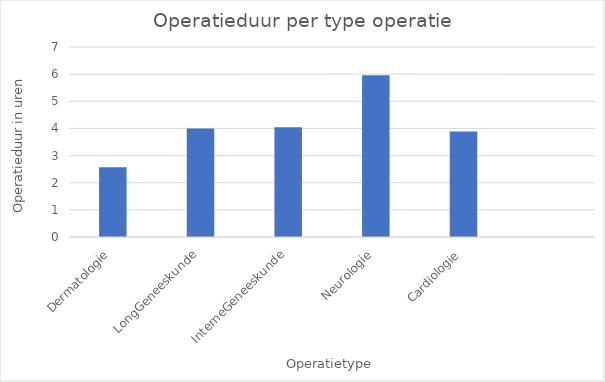
| Category | Series 0 |
|---|---|
| Dermatologie | 2.574 |
| LongGeneeskunde | 4 |
| InterneGeneeskunde | 4.043 |
| Neurologie | 5.961 |
| Cardiologie | 3.887 |